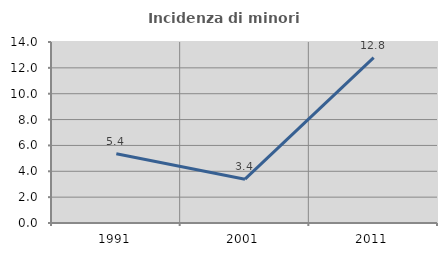
| Category | Incidenza di minori stranieri |
|---|---|
| 1991.0 | 5.357 |
| 2001.0 | 3.39 |
| 2011.0 | 12.791 |